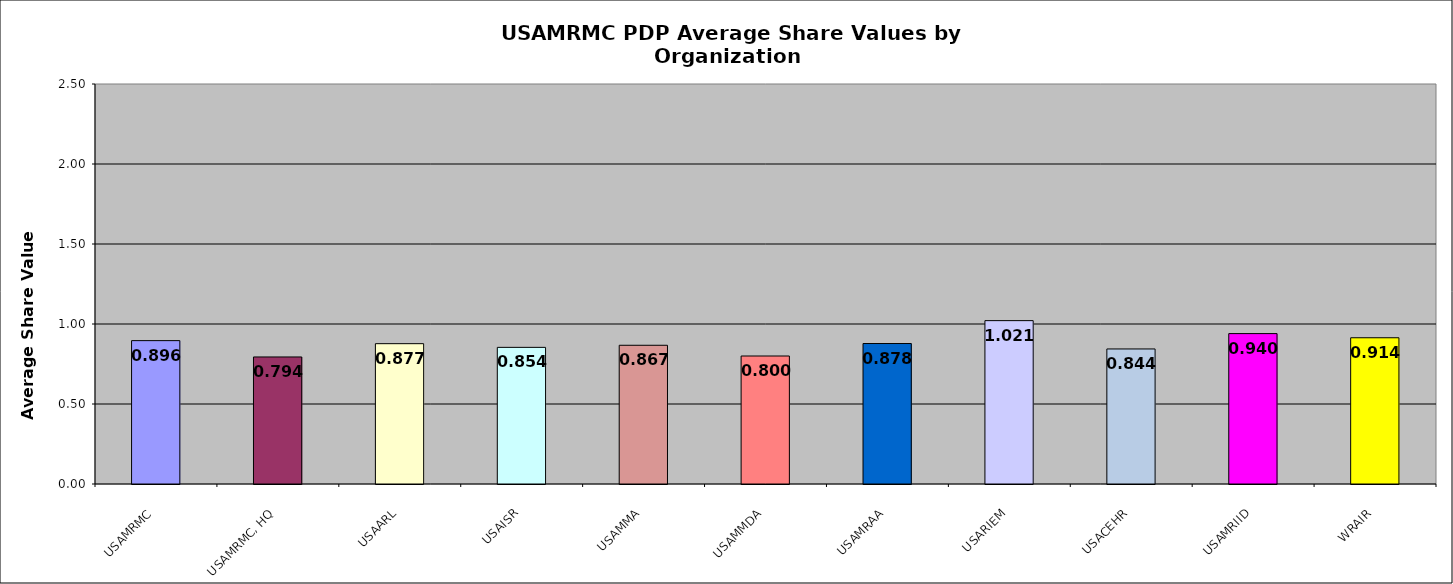
| Category | Series 0 |
|---|---|
| USAMRMC | 0.896 |
| USAMRMC, HQ | 0.794 |
| USAARL | 0.877 |
| USAISR | 0.854 |
| USAMMA | 0.867 |
| USAMMDA | 0.8 |
| USAMRAA | 0.878 |
| USARIEM | 1.021 |
| USACEHR | 0.844 |
| USAMRIID | 0.94 |
| WRAIR | 0.914 |